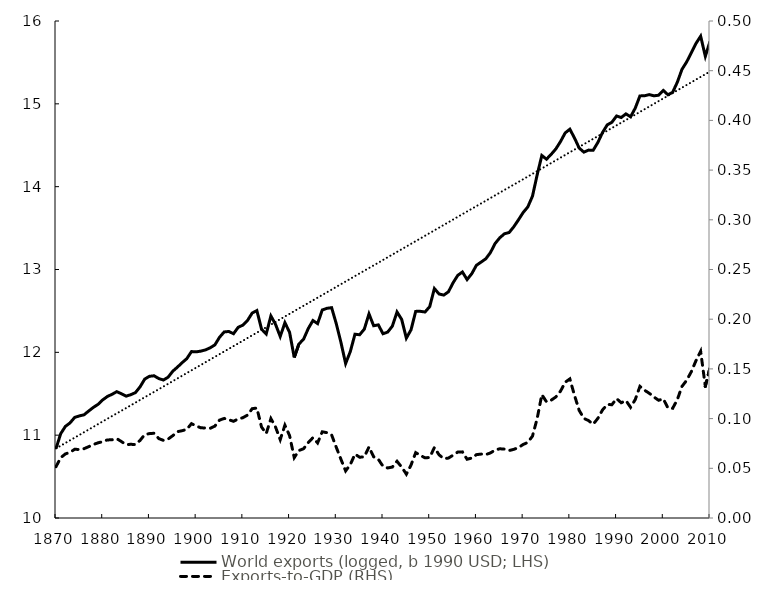
| Category | World exports (logged, b 1990 USD; LHS) | Series 1 |
|---|---|---|
| 1870.0 | 10.838 | 10.84 |
| 1871.0 | 11.017 | 10.872 |
| 1872.0 | 11.105 | 10.905 |
| 1873.0 | 11.148 | 10.938 |
| 1874.0 | 11.214 | 10.97 |
| 1875.0 | 11.233 | 11.003 |
| 1876.0 | 11.246 | 11.035 |
| 1877.0 | 11.292 | 11.068 |
| 1878.0 | 11.335 | 11.1 |
| 1879.0 | 11.372 | 11.133 |
| 1880.0 | 11.426 | 11.165 |
| 1881.0 | 11.467 | 11.198 |
| 1882.0 | 11.493 | 11.23 |
| 1883.0 | 11.525 | 11.263 |
| 1884.0 | 11.501 | 11.295 |
| 1885.0 | 11.471 | 11.328 |
| 1886.0 | 11.488 | 11.36 |
| 1887.0 | 11.514 | 11.393 |
| 1888.0 | 11.584 | 11.425 |
| 1889.0 | 11.677 | 11.458 |
| 1890.0 | 11.711 | 11.49 |
| 1891.0 | 11.717 | 11.523 |
| 1892.0 | 11.683 | 11.555 |
| 1893.0 | 11.666 | 11.588 |
| 1894.0 | 11.7 | 11.62 |
| 1895.0 | 11.772 | 11.653 |
| 1896.0 | 11.822 | 11.685 |
| 1897.0 | 11.875 | 11.718 |
| 1898.0 | 11.924 | 11.75 |
| 1899.0 | 12.009 | 11.783 |
| 1900.0 | 12.006 | 11.815 |
| 1901.0 | 12.015 | 11.848 |
| 1902.0 | 12.029 | 11.88 |
| 1903.0 | 12.055 | 11.913 |
| 1904.0 | 12.089 | 11.945 |
| 1905.0 | 12.181 | 11.978 |
| 1906.0 | 12.246 | 12.01 |
| 1907.0 | 12.252 | 12.043 |
| 1908.0 | 12.225 | 12.075 |
| 1909.0 | 12.302 | 12.108 |
| 1910.0 | 12.328 | 12.14 |
| 1911.0 | 12.385 | 12.173 |
| 1912.0 | 12.474 | 12.205 |
| 1913.0 | 12.504 | 12.238 |
| 1914.0 | 12.28 | 12.27 |
| 1915.0 | 12.222 | 12.303 |
| 1916.0 | 12.439 | 12.335 |
| 1917.0 | 12.337 | 12.368 |
| 1918.0 | 12.191 | 12.4 |
| 1919.0 | 12.358 | 12.433 |
| 1920.0 | 12.243 | 12.465 |
| 1921.0 | 11.938 | 12.498 |
| 1922.0 | 12.1 | 12.53 |
| 1923.0 | 12.159 | 12.563 |
| 1924.0 | 12.287 | 12.595 |
| 1925.0 | 12.384 | 12.628 |
| 1926.0 | 12.347 | 12.66 |
| 1927.0 | 12.512 | 12.693 |
| 1928.0 | 12.531 | 12.725 |
| 1929.0 | 12.539 | 12.758 |
| 1930.0 | 12.345 | 12.79 |
| 1931.0 | 12.119 | 12.823 |
| 1932.0 | 11.865 | 12.855 |
| 1933.0 | 12.009 | 12.888 |
| 1934.0 | 12.219 | 12.92 |
| 1935.0 | 12.212 | 12.953 |
| 1936.0 | 12.28 | 12.985 |
| 1937.0 | 12.464 | 13.018 |
| 1938.0 | 12.321 | 13.05 |
| 1939.0 | 12.331 | 13.083 |
| 1940.0 | 12.224 | 13.115 |
| 1941.0 | 12.244 | 13.148 |
| 1942.0 | 12.316 | 13.18 |
| 1943.0 | 12.487 | 13.213 |
| 1944.0 | 12.397 | 13.245 |
| 1945.0 | 12.172 | 13.278 |
| 1946.0 | 12.272 | 13.31 |
| 1947.0 | 12.494 | 13.343 |
| 1948.0 | 12.495 | 13.375 |
| 1949.0 | 12.487 | 13.408 |
| 1950.0 | 12.552 | 13.44 |
| 1951.0 | 12.77 | 13.473 |
| 1952.0 | 12.704 | 13.505 |
| 1953.0 | 12.691 | 13.538 |
| 1954.0 | 12.73 | 13.57 |
| 1955.0 | 12.839 | 13.603 |
| 1956.0 | 12.929 | 13.635 |
| 1957.0 | 12.97 | 13.668 |
| 1958.0 | 12.879 | 13.7 |
| 1959.0 | 12.949 | 13.733 |
| 1960.0 | 13.051 | 13.765 |
| 1961.0 | 13.09 | 13.798 |
| 1962.0 | 13.129 | 13.83 |
| 1963.0 | 13.205 | 13.863 |
| 1964.0 | 13.314 | 13.895 |
| 1965.0 | 13.383 | 13.928 |
| 1966.0 | 13.432 | 13.96 |
| 1967.0 | 13.446 | 13.993 |
| 1968.0 | 13.516 | 14.025 |
| 1969.0 | 13.6 | 14.058 |
| 1970.0 | 13.688 | 14.09 |
| 1971.0 | 13.755 | 14.123 |
| 1972.0 | 13.886 | 14.155 |
| 1973.0 | 14.143 | 14.188 |
| 1974.0 | 14.376 | 14.22 |
| 1975.0 | 14.332 | 14.253 |
| 1976.0 | 14.39 | 14.285 |
| 1977.0 | 14.456 | 14.318 |
| 1978.0 | 14.545 | 14.35 |
| 1979.0 | 14.649 | 14.383 |
| 1980.0 | 14.694 | 14.415 |
| 1981.0 | 14.587 | 14.448 |
| 1982.0 | 14.466 | 14.48 |
| 1983.0 | 14.417 | 14.513 |
| 1984.0 | 14.441 | 14.545 |
| 1985.0 | 14.441 | 14.578 |
| 1986.0 | 14.534 | 14.61 |
| 1987.0 | 14.654 | 14.643 |
| 1988.0 | 14.746 | 14.675 |
| 1989.0 | 14.777 | 14.708 |
| 1990.0 | 14.853 | 14.74 |
| 1991.0 | 14.835 | 14.773 |
| 1992.0 | 14.879 | 14.805 |
| 1993.0 | 14.843 | 14.838 |
| 1994.0 | 14.948 | 14.87 |
| 1995.0 | 15.096 | 14.903 |
| 1996.0 | 15.097 | 14.935 |
| 1997.0 | 15.111 | 14.968 |
| 1998.0 | 15.097 | 15 |
| 1999.0 | 15.104 | 15.033 |
| 2000.0 | 15.162 | 15.065 |
| 2001.0 | 15.109 | 15.098 |
| 2002.0 | 15.139 | 15.13 |
| 2003.0 | 15.26 | 15.163 |
| 2004.0 | 15.416 | 15.195 |
| 2005.0 | 15.506 | 15.228 |
| 2006.0 | 15.616 | 15.26 |
| 2007.0 | 15.729 | 15.293 |
| 2008.0 | 15.817 | 15.325 |
| 2009.0 | 15.574 | 15.358 |
| 2010.0 | 15.754 | 15.39 |